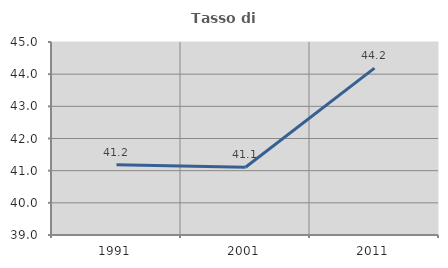
| Category | Tasso di occupazione   |
|---|---|
| 1991.0 | 41.187 |
| 2001.0 | 41.106 |
| 2011.0 | 44.188 |